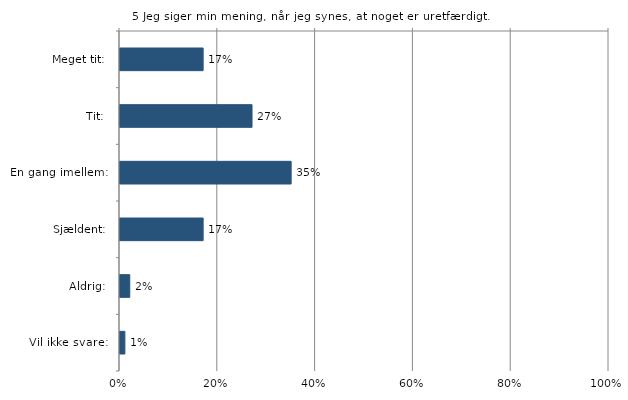
| Category | Jeg siger min mening, når jeg synes, at noget er uretfærdigt |
|---|---|
| Meget tit:  | 0.17 |
| Tit:  | 0.27 |
| En gang imellem:  | 0.35 |
| Sjældent:  | 0.17 |
| Aldrig:  | 0.02 |
| Vil ikke svare:  | 0.01 |